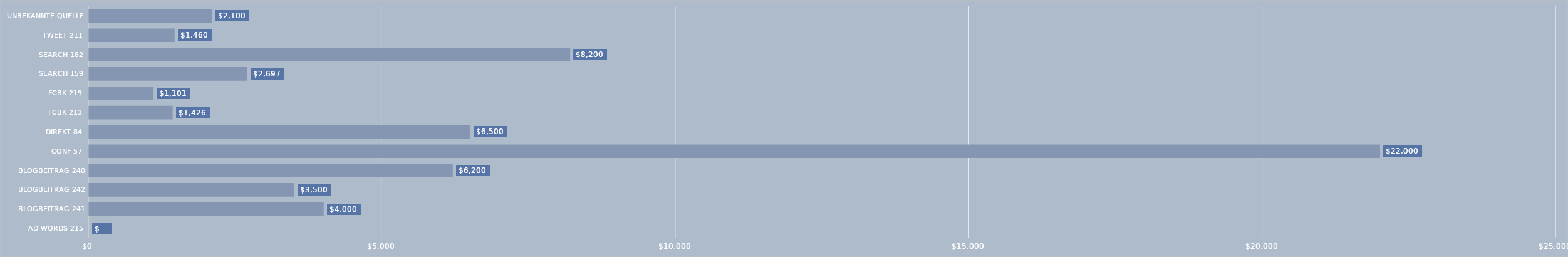
| Category | Series 0 |
|---|---|
| AD WORDS 215 | 0 |
| BLOGBEITRAG 241 | 4000 |
| BLOGBEITRAG 242 | 3500 |
| BLOGBEITRAG 240 | 6200 |
| CONF 57 | 22000 |
| DIREKT 84 | 6500 |
| FCBK 213 | 1426 |
| FCBK 219 | 1101 |
| SEARCH 159 | 2697 |
| SEARCH 182 | 8200 |
| TWEET 211 | 1460 |
| UNBEKANNTE QUELLE | 2100 |